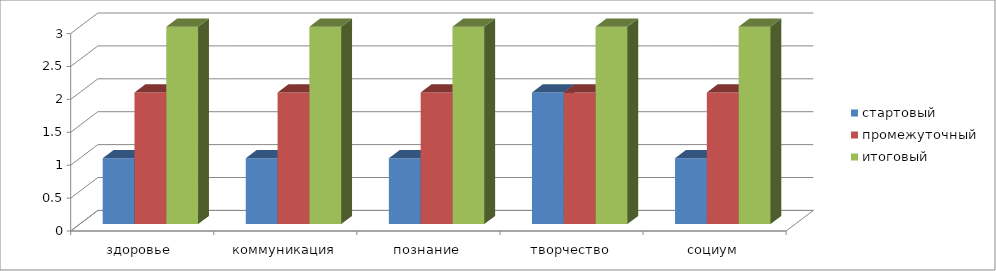
| Category | стартовый | промежуточный | итоговый |
|---|---|---|---|
| здоровье  | 1 | 2 | 3 |
| коммуникация | 1 | 2 | 3 |
| познание | 1 | 2 | 3 |
| творчество | 2 | 2 | 3 |
| социум | 1 | 2 | 3 |